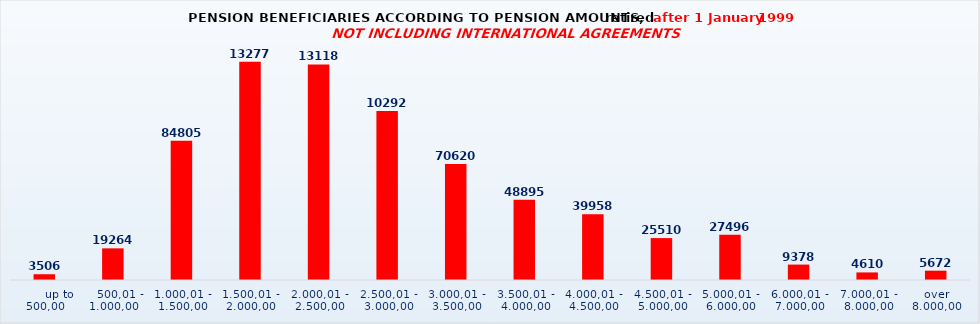
| Category | Series 0 |
|---|---|
|       up to 500,00 | 3506 |
|    500,01 - 1.000,00 | 19264 |
| 1.000,01 - 1.500,00 | 84805 |
| 1.500,01 - 2.000,00 | 132773 |
| 2.000,01 - 2.500,00 | 131186 |
| 2.500,01 - 3.000,00 | 102929 |
| 3.000,01 - 3.500,00 | 70620 |
| 3.500,01 - 4.000,00 | 48895 |
| 4.000,01 - 4.500,00 | 39958 |
| 4.500,01 - 5.000,00 | 25510 |
| 5.000,01 - 6.000,00 | 27496 |
| 6.000,01 - 7.000,00 | 9378 |
| 7.000,01 - 8.000,00 | 4610 |
| over 8.000,00 | 5672 |